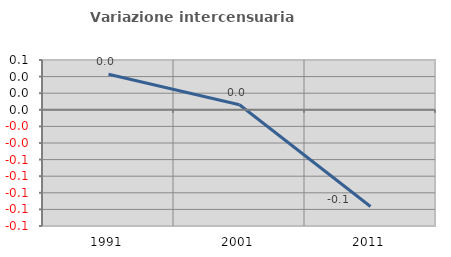
| Category | Variazione intercensuaria annua |
|---|---|
| 1991.0 | 0.043 |
| 2001.0 | 0.006 |
| 2011.0 | -0.117 |